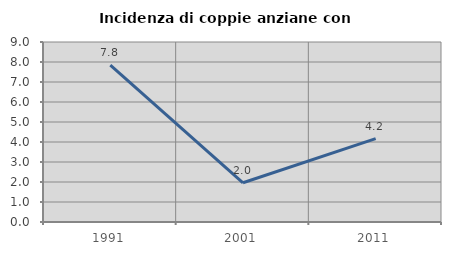
| Category | Incidenza di coppie anziane con figli |
|---|---|
| 1991.0 | 7.843 |
| 2001.0 | 1.961 |
| 2011.0 | 4.167 |